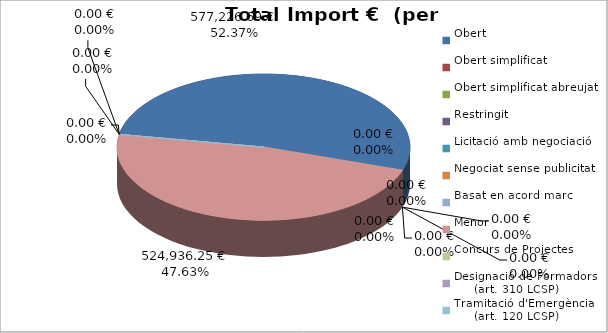
| Category | Total preu
(amb IVA) |
|---|---|
| Obert | 577226.69 |
| Obert simplificat | 0 |
| Obert simplificat abreujat | 0 |
| Restringit | 0 |
| Licitació amb negociació | 0 |
| Negociat sense publicitat | 0 |
| Basat en acord marc | 0 |
| Menor | 524936.25 |
| Concurs de Projectes | 0 |
| Designació de Formadors
     (art. 310 LCSP) | 0 |
| Tramitació d'Emergència
     (art. 120 LCSP) | 0 |